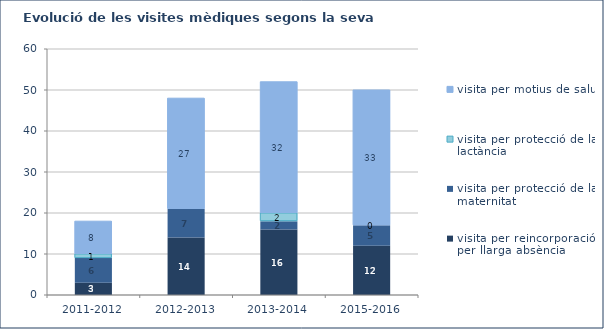
| Category | visita per reincorporació per llarga absència | visita per protecció de la maternitat | visita per protecció de la lactància | visita per motius de salut |
|---|---|---|---|---|
| 2011-2012 | 3 | 6 | 1 | 8 |
| 2012-2013 | 14 | 7 | 0 | 27 |
| 2013-2014 | 16 | 2 | 2 | 32 |
| 2015-2016 | 12 | 5 | 0 | 33 |